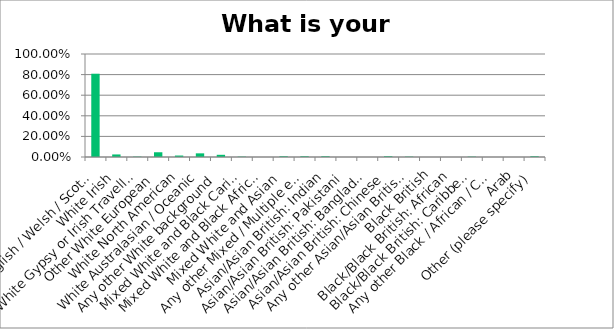
| Category | Responses |
|---|---|
| White English / Welsh / Scottish / Northern Irish / British | 0.808 |
| White Irish | 0.025 |
| White Gypsy or Irish Traveller | 0.004 |
| Other White European | 0.046 |
| White North American | 0.014 |
| White Australasian / Oceanic | 0.036 |
| Any other White background | 0.021 |
| Mixed White and Black Caribbean | 0.004 |
| Mixed White and Black African | 0 |
| Mixed White and Asian | 0.007 |
| Any other Mixed / Multiple ethnic background | 0.007 |
| Asian/Asian British: Indian | 0.007 |
| Asian/Asian British: Pakistani | 0 |
| Asian/Asian British: Bangladeshi | 0 |
| Asian/Asian British: Chinese | 0.007 |
| Any other Asian/Asian British background | 0.004 |
| Black British | 0 |
| Black/Black British: African | 0 |
| Black/Black British: Caribbean | 0.004 |
| Any other Black / African / Caribbean background | 0 |
| Arab | 0 |
| Other (please specify) | 0.007 |